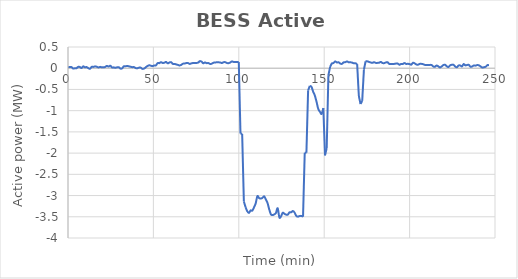
| Category | BESS Active Power |
|---|---|
| 0.0 | 0.021 |
| 0.99 | 0.028 |
| 1.98 | 0.028 |
| 2.97 | -0.007 |
| 3.96 | -0.001 |
| 4.95 | -0.001 |
| 5.94 | 0.032 |
| 6.93 | 0.028 |
| 7.92 | 0.005 |
| 8.91 | 0.044 |
| 9.9 | 0.021 |
| 10.89 | 0.028 |
| 11.88 | 0.001 |
| 12.87 | -0.013 |
| 13.86 | 0.031 |
| 14.85 | 0.031 |
| 15.84 | 0.044 |
| 16.83 | 0.036 |
| 17.82 | 0.018 |
| 18.81 | 0.032 |
| 19.8 | 0.021 |
| 20.79 | 0.021 |
| 21.78 | 0.03 |
| 22.77 | 0.055 |
| 23.76 | 0.038 |
| 24.75 | 0.059 |
| 25.74 | 0.02 |
| 26.73 | 0.02 |
| 27.72 | 0.011 |
| 28.71 | 0.02 |
| 29.7 | 0.024 |
| 30.69 | -0.008 |
| 31.68 | -0.004 |
| 32.67 | 0.045 |
| 33.66 | 0.045 |
| 34.65 | 0.053 |
| 35.64 | 0.045 |
| 36.63 | 0.035 |
| 37.62 | 0.025 |
| 38.61 | 0.028 |
| 39.6 | 0.004 |
| 40.59 | -0.001 |
| 41.58 | 0.014 |
| 42.57 | 0.014 |
| 43.56 | -0.015 |
| 44.55 | -0.008 |
| 45.54 | 0.023 |
| 46.53 | 0.053 |
| 47.52 | 0.069 |
| 48.51 | 0.06 |
| 49.5 | 0.049 |
| 50.49 | 0.066 |
| 51.48 | 0.066 |
| 52.47 | 0.12 |
| 53.46 | 0.12 |
| 54.45 | 0.143 |
| 55.44 | 0.124 |
| 56.43 | 0.13 |
| 57.42 | 0.149 |
| 58.41 | 0.115 |
| 59.4 | 0.136 |
| 60.39 | 0.141 |
| 61.38 | 0.102 |
| 62.37 | 0.102 |
| 63.36 | 0.089 |
| 64.35 | 0.079 |
| 65.34 | 0.065 |
| 66.33 | 0.08 |
| 67.32 | 0.107 |
| 68.31 | 0.111 |
| 69.3 | 0.121 |
| 70.29 | 0.121 |
| 71.28 | 0.102 |
| 72.27 | 0.114 |
| 73.26 | 0.123 |
| 74.25 | 0.125 |
| 75.24 | 0.125 |
| 76.23 | 0.132 |
| 77.22 | 0.167 |
| 78.21 | 0.154 |
| 79.2 | 0.117 |
| 80.19 | 0.135 |
| 81.18 | 0.119 |
| 82.17 | 0.123 |
| 83.16 | 0.101 |
| 84.15 | 0.107 |
| 85.14 | 0.129 |
| 86.13 | 0.135 |
| 87.12 | 0.139 |
| 88.11 | 0.139 |
| 89.1 | 0.135 |
| 90.09 | 0.123 |
| 91.08 | 0.142 |
| 92.07 | 0.142 |
| 93.06 | 0.123 |
| 94.05 | 0.12 |
| 95.04 | 0.137 |
| 96.03 | 0.161 |
| 97.02 | 0.147 |
| 98.01 | 0.147 |
| 99.0 | 0.147 |
| 99.99 | 0.144 |
| 100.98 | -1.536 |
| 101.97 | -1.55 |
| 102.96 | -3.137 |
| 103.95 | -3.273 |
| 104.94 | -3.368 |
| 105.93 | -3.41 |
| 106.92 | -3.35 |
| 107.91 | -3.356 |
| 108.9 | -3.278 |
| 109.89 | -3.184 |
| 110.88 | -3.014 |
| 111.87 | -3.059 |
| 112.86 | -3.071 |
| 113.85 | -3.054 |
| 114.84 | -3.018 |
| 115.83 | -3.091 |
| 116.82 | -3.175 |
| 117.81 | -3.325 |
| 118.8 | -3.442 |
| 119.79 | -3.461 |
| 120.78 | -3.443 |
| 121.77 | -3.409 |
| 122.76 | -3.299 |
| 123.75 | -3.515 |
| 124.74 | -3.488 |
| 125.73 | -3.405 |
| 126.72 | -3.429 |
| 127.71 | -3.45 |
| 128.7 | -3.448 |
| 129.69 | -3.395 |
| 130.68 | -3.395 |
| 131.67 | -3.363 |
| 132.66 | -3.401 |
| 133.65 | -3.479 |
| 134.64 | -3.498 |
| 135.63 | -3.482 |
| 136.62 | -3.48 |
| 137.61 | -3.497 |
| 138.6 | -1.992 |
| 139.59 | -1.992 |
| 140.58 | -0.522 |
| 141.57 | -0.416 |
| 142.56 | -0.439 |
| 143.55 | -0.554 |
| 144.54 | -0.645 |
| 145.53 | -0.794 |
| 146.52 | -0.958 |
| 147.51 | -1.027 |
| 148.5 | -1.077 |
| 149.49 | -0.94 |
| 150.48 | -2.053 |
| 151.47 | -1.88 |
| 152.46 | -0.167 |
| 153.45 | 0.03 |
| 154.44 | 0.111 |
| 155.43 | 0.122 |
| 156.42 | 0.161 |
| 157.41 | 0.136 |
| 158.4 | 0.141 |
| 159.39 | 0.11 |
| 160.38 | 0.103 |
| 161.37 | 0.138 |
| 162.36 | 0.143 |
| 163.35 | 0.16 |
| 164.34 | 0.139 |
| 165.33 | 0.139 |
| 166.32 | 0.133 |
| 167.31 | 0.117 |
| 168.3 | 0.115 |
| 169.29 | 0.097 |
| 170.28 | -0.654 |
| 171.27 | -0.843 |
| 172.26 | -0.77 |
| 173.25 | -0.032 |
| 174.24 | 0.163 |
| 175.23 | 0.163 |
| 176.22 | 0.148 |
| 177.21 | 0.136 |
| 178.2 | 0.127 |
| 179.19 | 0.142 |
| 180.18 | 0.126 |
| 181.17 | 0.126 |
| 182.16 | 0.13 |
| 183.15 | 0.149 |
| 184.14 | 0.123 |
| 185.13 | 0.12 |
| 186.12 | 0.137 |
| 187.11 | 0.14 |
| 188.1 | 0.101 |
| 189.09 | 0.097 |
| 190.08 | 0.099 |
| 191.07 | 0.102 |
| 192.06 | 0.11 |
| 193.05 | 0.11 |
| 194.04 | 0.082 |
| 195.03 | 0.101 |
| 196.02 | 0.101 |
| 197.01 | 0.122 |
| 198.0 | 0.101 |
| 198.99 | 0.104 |
| 199.98 | 0.097 |
| 200.97 | 0.085 |
| 201.96 | 0.128 |
| 202.95 | 0.114 |
| 203.94 | 0.089 |
| 204.93 | 0.083 |
| 205.92 | 0.102 |
| 206.91 | 0.102 |
| 207.9 | 0.095 |
| 208.89 | 0.078 |
| 209.88 | 0.078 |
| 210.87 | 0.076 |
| 211.86 | 0.078 |
| 212.85 | 0.076 |
| 213.84 | 0.042 |
| 214.83 | 0.034 |
| 215.82 | 0.065 |
| 216.81 | 0.044 |
| 217.8 | 0.018 |
| 218.79 | 0.043 |
| 219.78 | 0.075 |
| 220.77 | 0.082 |
| 221.76 | 0.045 |
| 222.75 | 0.028 |
| 223.74 | 0.069 |
| 224.73 | 0.082 |
| 225.72 | 0.082 |
| 226.71 | 0.039 |
| 227.7 | 0.024 |
| 228.69 | 0.064 |
| 229.68 | 0.064 |
| 230.67 | 0.042 |
| 231.66 | 0.098 |
| 232.65 | 0.067 |
| 233.64 | 0.076 |
| 234.63 | 0.08 |
| 235.62 | 0.035 |
| 236.61 | 0.042 |
| 237.6 | 0.064 |
| 238.59 | 0.061 |
| 239.58 | 0.074 |
| 240.57 | 0.068 |
| 241.56 | 0.043 |
| 242.55 | 0.015 |
| 243.54 | 0.024 |
| 244.53 | 0.035 |
| 245.52 | 0.072 |
| 246.51 | 0.071 |